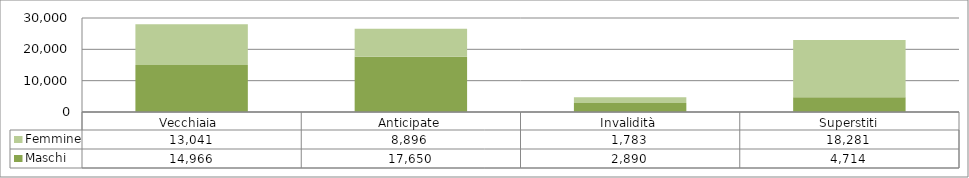
| Category | Maschi | Femmine |
|---|---|---|
| Vecchiaia  | 14966 | 13041 |
| Anticipate | 17650 | 8896 |
| Invalidità | 2890 | 1783 |
| Superstiti | 4714 | 18281 |